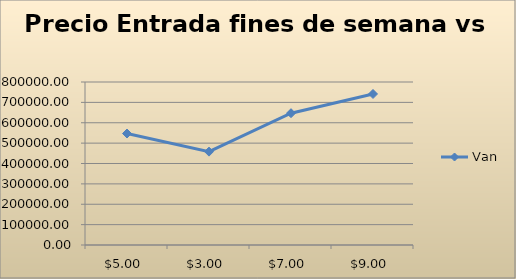
| Category | Van |
|---|---|
| 5.0 | 547148.43 |
| 3.0 | 458207.449 |
| 7.0 | 646898.687 |
| 9.0 | 741244.306 |